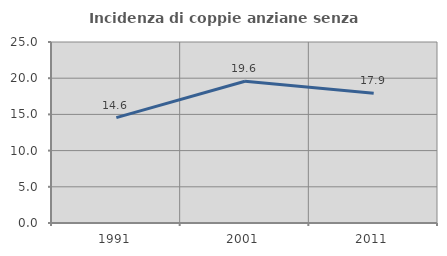
| Category | Incidenza di coppie anziane senza figli  |
|---|---|
| 1991.0 | 14.557 |
| 2001.0 | 19.58 |
| 2011.0 | 17.91 |